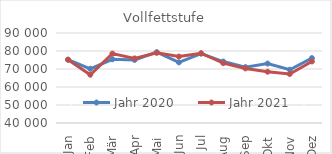
| Category | Jahr 2020 | Jahr 2021 |
|---|---|---|
| 0 | 75165.283 | 75141.609 |
| 1 | 70126.896 | 66818.351 |
| 2 | 75378.868 | 78563.277 |
| 3 | 75059.452 | 75877.179 |
| 4 | 79357.36 | 78970.573 |
| 5 | 73699.146 | 76913.692 |
| 6 | 78532.275 | 78768.511 |
| 7 | 74134.688 | 73260.75 |
| 8 | 71021.104 | 70331.444 |
| 9 | 73024.001 | 68501.305 |
| 10 | 69582.576 | 67239.484 |
| 11 | 76049.275 | 74196.233 |